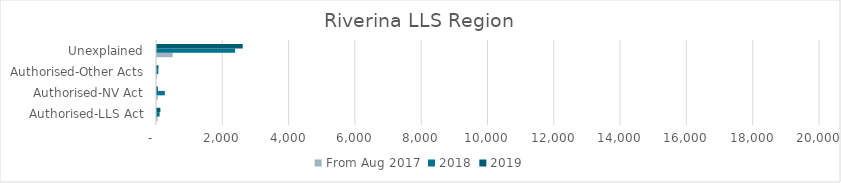
| Category | From Aug 2017 | 2018 | 2019 |
|---|---|---|---|
| Authorised-LLS Act | 20 | 79 | 102 |
| Authorised-NV Act | 26 | 236 | 26 |
| Authorised-Other Acts | 6 | 39 | 43 |
| Unexplained | 472 | 2356 | 2586 |